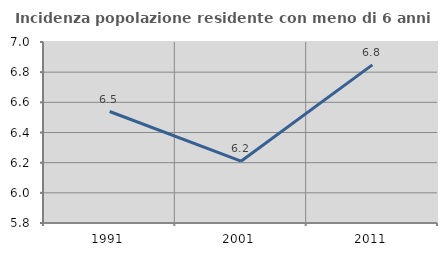
| Category | Incidenza popolazione residente con meno di 6 anni |
|---|---|
| 1991.0 | 6.539 |
| 2001.0 | 6.21 |
| 2011.0 | 6.849 |